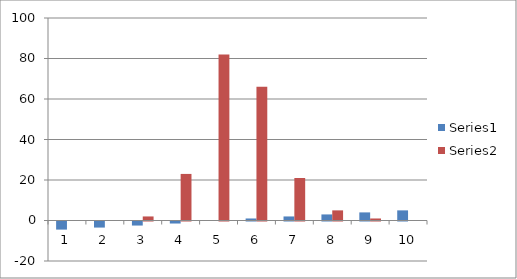
| Category | Series 0 | Series 1 |
|---|---|---|
| 0 | -4 | 0 |
| 1 | -3 | 0 |
| 2 | -2 | 2 |
| 3 | -1 | 23 |
| 4 | 0 | 82 |
| 5 | 1 | 66 |
| 6 | 2 | 21 |
| 7 | 3 | 5 |
| 8 | 4 | 1 |
| 9 | 5 | 0 |